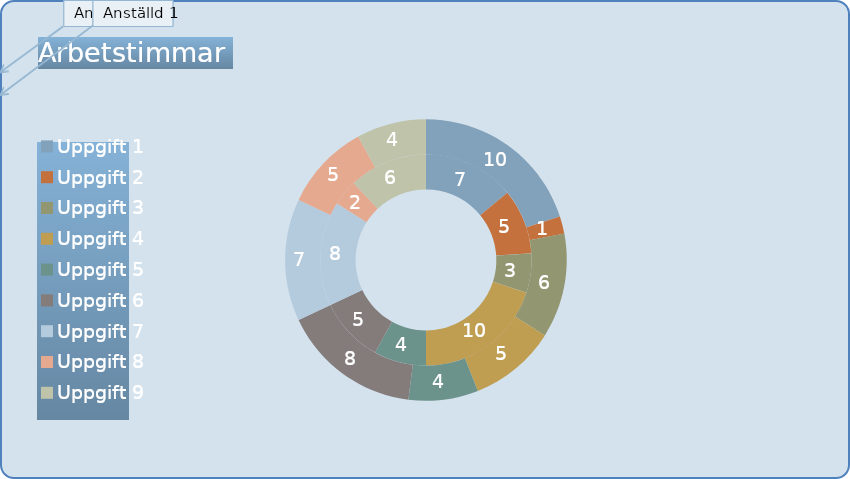
| Category | Anställd 1 (timmar) | Anställd 2 (timmar) |
|---|---|---|
| Uppgift 1 | 7 | 10 |
| Uppgift 2 | 5 | 1 |
| Uppgift 3 | 3 | 6 |
| Uppgift 4 | 10 | 5 |
| Uppgift 5 | 4 | 4 |
| Uppgift 6 | 5 | 8 |
| Uppgift 7 | 8 | 7 |
| Uppgift 8 | 2 | 5 |
| Uppgift 9 | 6 | 4 |